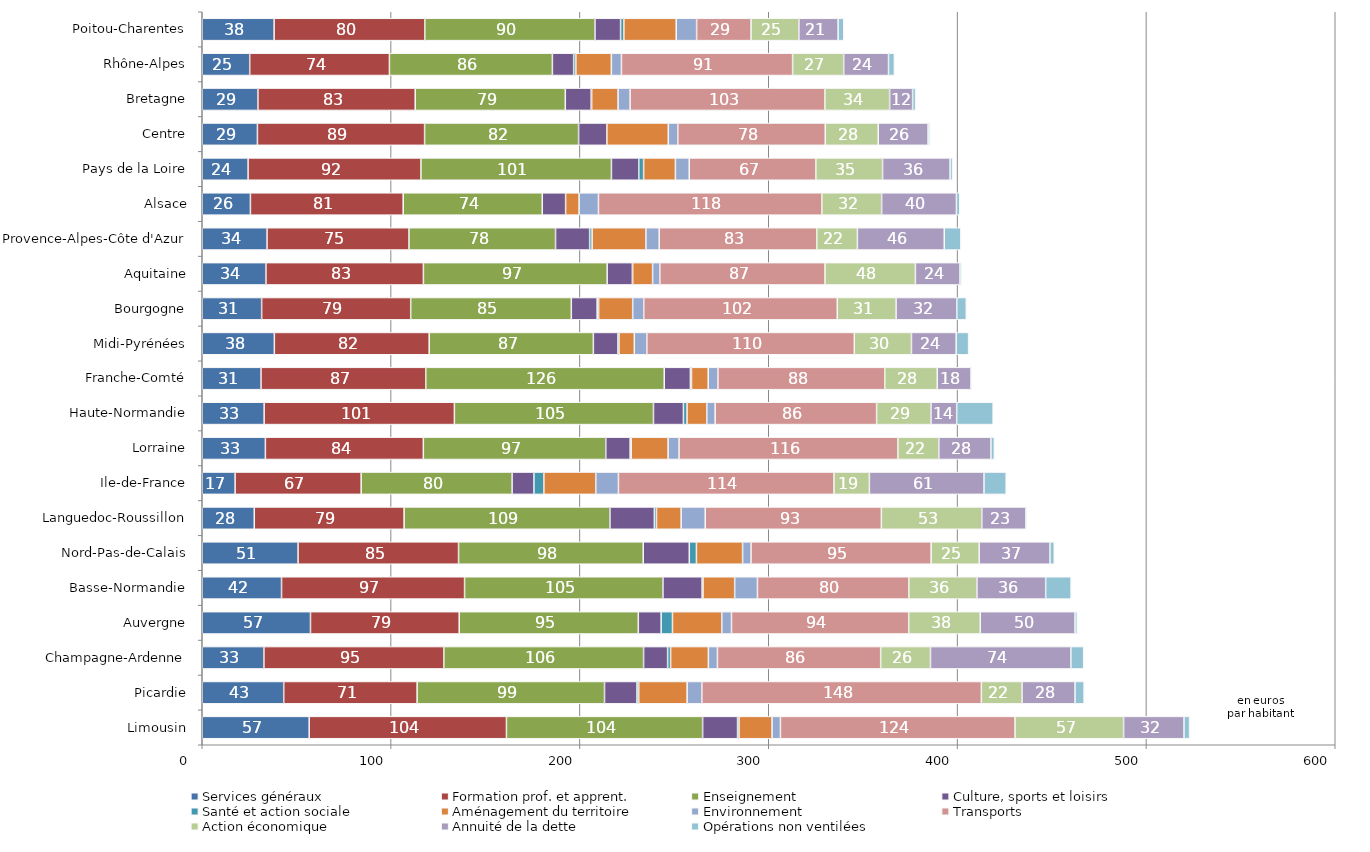
| Category | Services généraux | Formation prof. et apprent. | Enseignement | Culture, sports et loisirs | Santé et action sociale | Aménagement du territoire | Environnement | Transports | Action économique | Annuité de la dette | Opérations non ventilées |
|---|---|---|---|---|---|---|---|---|---|---|---|
| Limousin | 56.637 | 104.453 | 103.906 | 18.485 | 0.768 | 17.517 | 4.427 | 124.236 | 57.494 | 31.984 | 2.958 |
| Picardie | 43.151 | 70.64 | 99.239 | 17.196 | 0.91 | 25.636 | 7.802 | 148.027 | 21.531 | 28.065 | 4.823 |
| Champagne-Ardenne | 32.657 | 95.267 | 105.79 | 12.73 | 1.596 | 19.993 | 4.798 | 86.454 | 26.364 | 74.341 | 6.803 |
| Auvergne | 57.318 | 78.768 | 94.841 | 12.088 | 6.006 | 26.109 | 5.135 | 93.857 | 37.891 | 50.162 | 1.209 |
| Basse-Normandie | 41.99 | 96.933 | 105.05 | 20.751 | 0.479 | 16.754 | 12.056 | 80.179 | 36.054 | 36.399 | 13.472 |
| Nord-Pas-de-Calais | 50.746 | 84.987 | 97.791 | 24.405 | 3.782 | 24.443 | 4.46 | 95.388 | 25.433 | 37.467 | 2.306 |
| Languedoc-Roussillon | 27.551 | 79.349 | 109.005 | 23.529 | 1.124 | 13.051 | 12.754 | 93.277 | 53.187 | 23.377 | 0.305 |
| Ile-de-France | 17.397 | 66.768 | 79.921 | 11.563 | 5.259 | 27.486 | 12.01 | 114.138 | 18.76 | 60.68 | 11.76 |
| Lorraine | 33.431 | 83.652 | 96.612 | 12.911 | 0.559 | 19.545 | 5.795 | 115.881 | 21.688 | 27.589 | 1.807 |
| Haute-Normandie | 32.777 | 100.757 | 105.423 | 15.862 | 1.907 | 10.474 | 4.414 | 85.501 | 28.8 | 13.604 | 19.313 |
| Franche-Comté | 31.113 | 87.248 | 126.297 | 13.846 | 0.586 | 8.859 | 5.138 | 88.343 | 27.799 | 17.88 | 0.337 |
| Midi-Pyrénées | 38.182 | 82.004 | 86.935 | 12.961 | 0.601 | 8.128 | 6.634 | 109.872 | 30.255 | 23.686 | 6.577 |
| Bourgogne | 31.459 | 78.937 | 85.05 | 13.685 | 0.778 | 18.039 | 5.852 | 102.491 | 31.143 | 32.134 | 5.049 |
| Aquitaine | 33.729 | 83.388 | 97.313 | 13.345 | 0.171 | 10.554 | 3.828 | 87.451 | 47.878 | 23.591 | 0.779 |
| Provence-Alpes-Côte d'Azur | 34.309 | 75.175 | 77.617 | 18.049 | 1.323 | 28.48 | 7.04 | 83.428 | 21.524 | 45.999 | 8.806 |
| Alsace | 25.503 | 80.908 | 73.653 | 12.365 | 0 | 7.128 | 10.267 | 118.292 | 31.66 | 39.623 | 1.767 |
| Pays de la Loire | 24.27 | 91.548 | 100.881 | 14.458 | 2.586 | 16.832 | 7.329 | 67.041 | 35.347 | 35.726 | 1.32 |
| Centre | 29.224 | 88.524 | 81.555 | 14.982 | 0 | 32.533 | 5.014 | 78.095 | 28.069 | 26.39 | 0.985 |
| Bretagne | 29.489 | 83.299 | 79.473 | 13.711 | 0.245 | 14 | 6.359 | 103.143 | 34.295 | 12.193 | 1.589 |
| Rhône-Alpes | 25.135 | 73.986 | 86.307 | 11.257 | 1.164 | 18.802 | 5.342 | 90.647 | 27.042 | 23.757 | 3.087 |
| Poitou-Charentes | 38.064 | 79.787 | 90.124 | 13.563 | 1.737 | 27.716 | 10.817 | 28.827 | 25.332 | 20.77 | 2.993 |